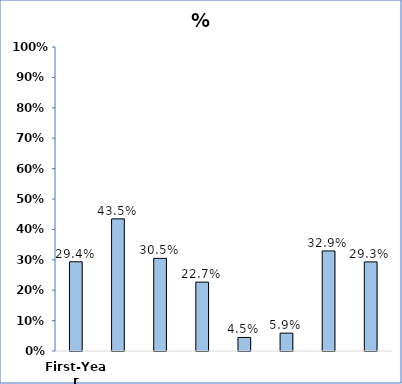
| Category | % Accepted |
|---|---|
| First-Year | 0.294 |
| Transfer | 0.435 |
| Graduate | 0.305 |
| Law | 0.227 |
| Medical | 0.045 |
| Dental | 0.059 |
| Pharmacy | 0.329 |
| Nursing | 0.293 |